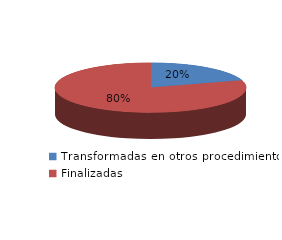
| Category | Series 0 |
|---|---|
| Transformadas en otros procedimientos | 33337 |
| Finalizadas | 132691 |